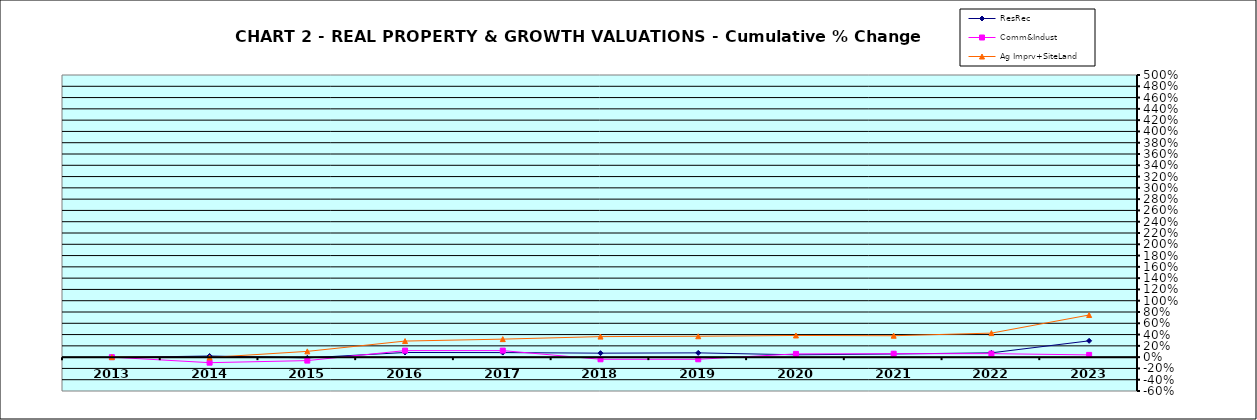
| Category | ResRec | Comm&Indust | Ag Imprv+SiteLand |
|---|---|---|---|
| 2013.0 | -0.006 | 0 | 0 |
| 2014.0 | 0.02 | -0.098 | -0.006 |
| 2015.0 | -0.013 | -0.061 | 0.102 |
| 2016.0 | 0.082 | 0.116 | 0.285 |
| 2017.0 | 0.081 | 0.116 | 0.319 |
| 2018.0 | 0.071 | -0.038 | 0.364 |
| 2019.0 | 0.076 | -0.038 | 0.37 |
| 2020.0 | 0.041 | 0.057 | 0.384 |
| 2021.0 | 0.056 | 0.061 | 0.38 |
| 2022.0 | 0.076 | 0.062 | 0.426 |
| 2023.0 | 0.289 | 0.04 | 0.747 |